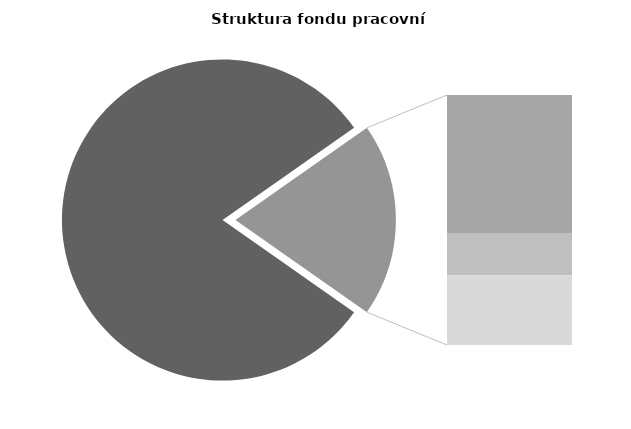
| Category | Series 0 |
|---|---|
| Průměrná měsíční 
odpracovaná doba  
bez přesčasu | 138.716 |
| Dovolená | 18.509 |
| Nemoc | 5.669 |
| Jiné | 9.362 |